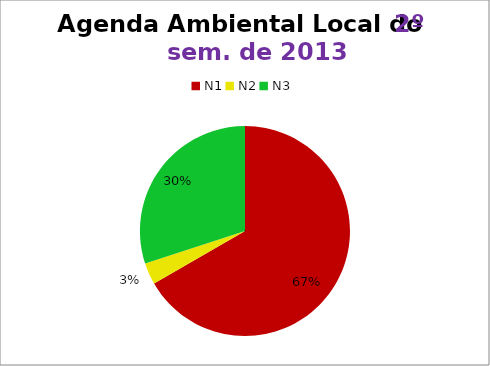
| Category | 2º/13 |
|---|---|
| N1 | 20 |
| N2 | 1 |
| N3 | 9 |